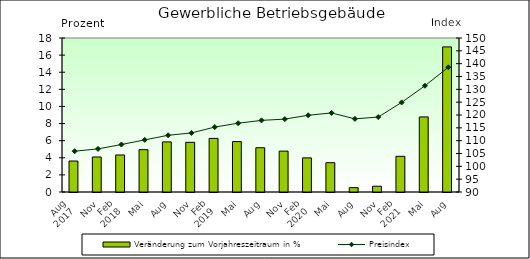
| Category | Veränderung zum Vorjahreszeitraum in % |
|---|---|
| 0 | 3.62 |
| 1 | 4.094 |
| 2 | 4.327 |
| 3 | 4.948 |
| 4 | 5.855 |
| 5 | 5.805 |
| 6 | 6.267 |
| 7 | 5.893 |
| 8 | 5.174 |
| 9 | 4.779 |
| 10 | 3.99 |
| 11 | 3.425 |
| 12 | 0.509 |
| 13 | 0.676 |
| 14 | 4.17 |
| 15 | 8.775 |
| 16 | 16.962 |